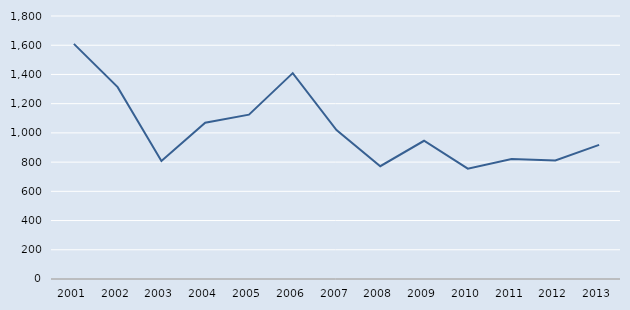
| Category | Series 0 |
|---|---|
| 2001.0 | 1609 |
| 2002.0 | 1313 |
| 2003.0 | 808 |
| 2004.0 | 1069 |
| 2005.0 | 1125 |
| 2006.0 | 1409 |
| 2007.0 | 1019 |
| 2008.0 | 772 |
| 2009.0 | 946 |
| 2010.0 | 755 |
| 2011.0 | 821 |
| 2012.0 | 811 |
| 2013.0 | 918 |